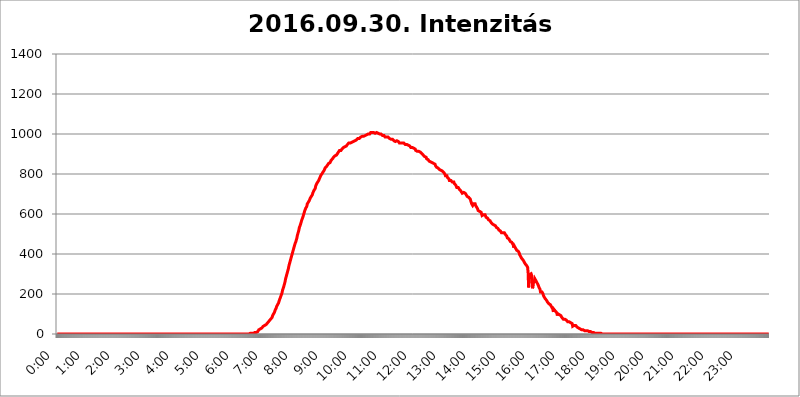
| Category | 2016.09.30. Intenzitás [W/m^2] |
|---|---|
| 0.0 | 0 |
| 0.0006944444444444445 | 0 |
| 0.001388888888888889 | 0 |
| 0.0020833333333333333 | 0 |
| 0.002777777777777778 | 0 |
| 0.003472222222222222 | 0 |
| 0.004166666666666667 | 0 |
| 0.004861111111111111 | 0 |
| 0.005555555555555556 | 0 |
| 0.0062499999999999995 | 0 |
| 0.006944444444444444 | 0 |
| 0.007638888888888889 | 0 |
| 0.008333333333333333 | 0 |
| 0.009027777777777779 | 0 |
| 0.009722222222222222 | 0 |
| 0.010416666666666666 | 0 |
| 0.011111111111111112 | 0 |
| 0.011805555555555555 | 0 |
| 0.012499999999999999 | 0 |
| 0.013194444444444444 | 0 |
| 0.013888888888888888 | 0 |
| 0.014583333333333332 | 0 |
| 0.015277777777777777 | 0 |
| 0.015972222222222224 | 0 |
| 0.016666666666666666 | 0 |
| 0.017361111111111112 | 0 |
| 0.018055555555555557 | 0 |
| 0.01875 | 0 |
| 0.019444444444444445 | 0 |
| 0.02013888888888889 | 0 |
| 0.020833333333333332 | 0 |
| 0.02152777777777778 | 0 |
| 0.022222222222222223 | 0 |
| 0.02291666666666667 | 0 |
| 0.02361111111111111 | 0 |
| 0.024305555555555556 | 0 |
| 0.024999999999999998 | 0 |
| 0.025694444444444447 | 0 |
| 0.02638888888888889 | 0 |
| 0.027083333333333334 | 0 |
| 0.027777777777777776 | 0 |
| 0.02847222222222222 | 0 |
| 0.029166666666666664 | 0 |
| 0.029861111111111113 | 0 |
| 0.030555555555555555 | 0 |
| 0.03125 | 0 |
| 0.03194444444444445 | 0 |
| 0.03263888888888889 | 0 |
| 0.03333333333333333 | 0 |
| 0.034027777777777775 | 0 |
| 0.034722222222222224 | 0 |
| 0.035416666666666666 | 0 |
| 0.036111111111111115 | 0 |
| 0.03680555555555556 | 0 |
| 0.0375 | 0 |
| 0.03819444444444444 | 0 |
| 0.03888888888888889 | 0 |
| 0.03958333333333333 | 0 |
| 0.04027777777777778 | 0 |
| 0.04097222222222222 | 0 |
| 0.041666666666666664 | 0 |
| 0.042361111111111106 | 0 |
| 0.04305555555555556 | 0 |
| 0.043750000000000004 | 0 |
| 0.044444444444444446 | 0 |
| 0.04513888888888889 | 0 |
| 0.04583333333333334 | 0 |
| 0.04652777777777778 | 0 |
| 0.04722222222222222 | 0 |
| 0.04791666666666666 | 0 |
| 0.04861111111111111 | 0 |
| 0.049305555555555554 | 0 |
| 0.049999999999999996 | 0 |
| 0.05069444444444445 | 0 |
| 0.051388888888888894 | 0 |
| 0.052083333333333336 | 0 |
| 0.05277777777777778 | 0 |
| 0.05347222222222222 | 0 |
| 0.05416666666666667 | 0 |
| 0.05486111111111111 | 0 |
| 0.05555555555555555 | 0 |
| 0.05625 | 0 |
| 0.05694444444444444 | 0 |
| 0.057638888888888885 | 0 |
| 0.05833333333333333 | 0 |
| 0.05902777777777778 | 0 |
| 0.059722222222222225 | 0 |
| 0.06041666666666667 | 0 |
| 0.061111111111111116 | 0 |
| 0.06180555555555556 | 0 |
| 0.0625 | 0 |
| 0.06319444444444444 | 0 |
| 0.06388888888888888 | 0 |
| 0.06458333333333334 | 0 |
| 0.06527777777777778 | 0 |
| 0.06597222222222222 | 0 |
| 0.06666666666666667 | 0 |
| 0.06736111111111111 | 0 |
| 0.06805555555555555 | 0 |
| 0.06874999999999999 | 0 |
| 0.06944444444444443 | 0 |
| 0.07013888888888889 | 0 |
| 0.07083333333333333 | 0 |
| 0.07152777777777779 | 0 |
| 0.07222222222222223 | 0 |
| 0.07291666666666667 | 0 |
| 0.07361111111111111 | 0 |
| 0.07430555555555556 | 0 |
| 0.075 | 0 |
| 0.07569444444444444 | 0 |
| 0.0763888888888889 | 0 |
| 0.07708333333333334 | 0 |
| 0.07777777777777778 | 0 |
| 0.07847222222222222 | 0 |
| 0.07916666666666666 | 0 |
| 0.0798611111111111 | 0 |
| 0.08055555555555556 | 0 |
| 0.08125 | 0 |
| 0.08194444444444444 | 0 |
| 0.08263888888888889 | 0 |
| 0.08333333333333333 | 0 |
| 0.08402777777777777 | 0 |
| 0.08472222222222221 | 0 |
| 0.08541666666666665 | 0 |
| 0.08611111111111112 | 0 |
| 0.08680555555555557 | 0 |
| 0.08750000000000001 | 0 |
| 0.08819444444444445 | 0 |
| 0.08888888888888889 | 0 |
| 0.08958333333333333 | 0 |
| 0.09027777777777778 | 0 |
| 0.09097222222222222 | 0 |
| 0.09166666666666667 | 0 |
| 0.09236111111111112 | 0 |
| 0.09305555555555556 | 0 |
| 0.09375 | 0 |
| 0.09444444444444444 | 0 |
| 0.09513888888888888 | 0 |
| 0.09583333333333333 | 0 |
| 0.09652777777777777 | 0 |
| 0.09722222222222222 | 0 |
| 0.09791666666666667 | 0 |
| 0.09861111111111111 | 0 |
| 0.09930555555555555 | 0 |
| 0.09999999999999999 | 0 |
| 0.10069444444444443 | 0 |
| 0.1013888888888889 | 0 |
| 0.10208333333333335 | 0 |
| 0.10277777777777779 | 0 |
| 0.10347222222222223 | 0 |
| 0.10416666666666667 | 0 |
| 0.10486111111111111 | 0 |
| 0.10555555555555556 | 0 |
| 0.10625 | 0 |
| 0.10694444444444444 | 0 |
| 0.1076388888888889 | 0 |
| 0.10833333333333334 | 0 |
| 0.10902777777777778 | 0 |
| 0.10972222222222222 | 0 |
| 0.1111111111111111 | 0 |
| 0.11180555555555556 | 0 |
| 0.11180555555555556 | 0 |
| 0.1125 | 0 |
| 0.11319444444444444 | 0 |
| 0.11388888888888889 | 0 |
| 0.11458333333333333 | 0 |
| 0.11527777777777777 | 0 |
| 0.11597222222222221 | 0 |
| 0.11666666666666665 | 0 |
| 0.1173611111111111 | 0 |
| 0.11805555555555557 | 0 |
| 0.11944444444444445 | 0 |
| 0.12013888888888889 | 0 |
| 0.12083333333333333 | 0 |
| 0.12152777777777778 | 0 |
| 0.12222222222222223 | 0 |
| 0.12291666666666667 | 0 |
| 0.12291666666666667 | 0 |
| 0.12361111111111112 | 0 |
| 0.12430555555555556 | 0 |
| 0.125 | 0 |
| 0.12569444444444444 | 0 |
| 0.12638888888888888 | 0 |
| 0.12708333333333333 | 0 |
| 0.16875 | 0 |
| 0.12847222222222224 | 0 |
| 0.12916666666666668 | 0 |
| 0.12986111111111112 | 0 |
| 0.13055555555555556 | 0 |
| 0.13125 | 0 |
| 0.13194444444444445 | 0 |
| 0.1326388888888889 | 0 |
| 0.13333333333333333 | 0 |
| 0.13402777777777777 | 0 |
| 0.13402777777777777 | 0 |
| 0.13472222222222222 | 0 |
| 0.13541666666666666 | 0 |
| 0.1361111111111111 | 0 |
| 0.13749999999999998 | 0 |
| 0.13819444444444443 | 0 |
| 0.1388888888888889 | 0 |
| 0.13958333333333334 | 0 |
| 0.14027777777777778 | 0 |
| 0.14097222222222222 | 0 |
| 0.14166666666666666 | 0 |
| 0.1423611111111111 | 0 |
| 0.14305555555555557 | 0 |
| 0.14375000000000002 | 0 |
| 0.14444444444444446 | 0 |
| 0.1451388888888889 | 0 |
| 0.1451388888888889 | 0 |
| 0.14652777777777778 | 0 |
| 0.14722222222222223 | 0 |
| 0.14791666666666667 | 0 |
| 0.1486111111111111 | 0 |
| 0.14930555555555555 | 0 |
| 0.15 | 0 |
| 0.15069444444444444 | 0 |
| 0.15138888888888888 | 0 |
| 0.15208333333333332 | 0 |
| 0.15277777777777776 | 0 |
| 0.15347222222222223 | 0 |
| 0.15416666666666667 | 0 |
| 0.15486111111111112 | 0 |
| 0.15555555555555556 | 0 |
| 0.15625 | 0 |
| 0.15694444444444444 | 0 |
| 0.15763888888888888 | 0 |
| 0.15833333333333333 | 0 |
| 0.15902777777777777 | 0 |
| 0.15972222222222224 | 0 |
| 0.16041666666666668 | 0 |
| 0.16111111111111112 | 0 |
| 0.16180555555555556 | 0 |
| 0.1625 | 0 |
| 0.16319444444444445 | 0 |
| 0.1638888888888889 | 0 |
| 0.16458333333333333 | 0 |
| 0.16527777777777777 | 0 |
| 0.16597222222222222 | 0 |
| 0.16666666666666666 | 0 |
| 0.1673611111111111 | 0 |
| 0.16805555555555554 | 0 |
| 0.16874999999999998 | 0 |
| 0.16944444444444443 | 0 |
| 0.17013888888888887 | 0 |
| 0.1708333333333333 | 0 |
| 0.17152777777777775 | 0 |
| 0.17222222222222225 | 0 |
| 0.1729166666666667 | 0 |
| 0.17361111111111113 | 0 |
| 0.17430555555555557 | 0 |
| 0.17500000000000002 | 0 |
| 0.17569444444444446 | 0 |
| 0.1763888888888889 | 0 |
| 0.17708333333333334 | 0 |
| 0.17777777777777778 | 0 |
| 0.17847222222222223 | 0 |
| 0.17916666666666667 | 0 |
| 0.1798611111111111 | 0 |
| 0.18055555555555555 | 0 |
| 0.18125 | 0 |
| 0.18194444444444444 | 0 |
| 0.1826388888888889 | 0 |
| 0.18333333333333335 | 0 |
| 0.1840277777777778 | 0 |
| 0.18472222222222223 | 0 |
| 0.18541666666666667 | 0 |
| 0.18611111111111112 | 0 |
| 0.18680555555555556 | 0 |
| 0.1875 | 0 |
| 0.18819444444444444 | 0 |
| 0.18888888888888888 | 0 |
| 0.18958333333333333 | 0 |
| 0.19027777777777777 | 0 |
| 0.1909722222222222 | 0 |
| 0.19166666666666665 | 0 |
| 0.19236111111111112 | 0 |
| 0.19305555555555554 | 0 |
| 0.19375 | 0 |
| 0.19444444444444445 | 0 |
| 0.1951388888888889 | 0 |
| 0.19583333333333333 | 0 |
| 0.19652777777777777 | 0 |
| 0.19722222222222222 | 0 |
| 0.19791666666666666 | 0 |
| 0.1986111111111111 | 0 |
| 0.19930555555555554 | 0 |
| 0.19999999999999998 | 0 |
| 0.20069444444444443 | 0 |
| 0.20138888888888887 | 0 |
| 0.2020833333333333 | 0 |
| 0.2027777777777778 | 0 |
| 0.2034722222222222 | 0 |
| 0.2041666666666667 | 0 |
| 0.20486111111111113 | 0 |
| 0.20555555555555557 | 0 |
| 0.20625000000000002 | 0 |
| 0.20694444444444446 | 0 |
| 0.2076388888888889 | 0 |
| 0.20833333333333334 | 0 |
| 0.20902777777777778 | 0 |
| 0.20972222222222223 | 0 |
| 0.21041666666666667 | 0 |
| 0.2111111111111111 | 0 |
| 0.21180555555555555 | 0 |
| 0.2125 | 0 |
| 0.21319444444444444 | 0 |
| 0.2138888888888889 | 0 |
| 0.21458333333333335 | 0 |
| 0.2152777777777778 | 0 |
| 0.21597222222222223 | 0 |
| 0.21666666666666667 | 0 |
| 0.21736111111111112 | 0 |
| 0.21805555555555556 | 0 |
| 0.21875 | 0 |
| 0.21944444444444444 | 0 |
| 0.22013888888888888 | 0 |
| 0.22083333333333333 | 0 |
| 0.22152777777777777 | 0 |
| 0.2222222222222222 | 0 |
| 0.22291666666666665 | 0 |
| 0.2236111111111111 | 0 |
| 0.22430555555555556 | 0 |
| 0.225 | 0 |
| 0.22569444444444445 | 0 |
| 0.2263888888888889 | 0 |
| 0.22708333333333333 | 0 |
| 0.22777777777777777 | 0 |
| 0.22847222222222222 | 0 |
| 0.22916666666666666 | 0 |
| 0.2298611111111111 | 0 |
| 0.23055555555555554 | 0 |
| 0.23124999999999998 | 0 |
| 0.23194444444444443 | 0 |
| 0.23263888888888887 | 0 |
| 0.2333333333333333 | 0 |
| 0.2340277777777778 | 0 |
| 0.2347222222222222 | 0 |
| 0.2354166666666667 | 0 |
| 0.23611111111111113 | 0 |
| 0.23680555555555557 | 0 |
| 0.23750000000000002 | 0 |
| 0.23819444444444446 | 0 |
| 0.2388888888888889 | 0 |
| 0.23958333333333334 | 0 |
| 0.24027777777777778 | 0 |
| 0.24097222222222223 | 0 |
| 0.24166666666666667 | 0 |
| 0.2423611111111111 | 0 |
| 0.24305555555555555 | 0 |
| 0.24375 | 0 |
| 0.24444444444444446 | 0 |
| 0.24513888888888888 | 0 |
| 0.24583333333333335 | 0 |
| 0.2465277777777778 | 0 |
| 0.24722222222222223 | 0 |
| 0.24791666666666667 | 0 |
| 0.24861111111111112 | 0 |
| 0.24930555555555556 | 0 |
| 0.25 | 0 |
| 0.25069444444444444 | 0 |
| 0.2513888888888889 | 0 |
| 0.2520833333333333 | 0 |
| 0.25277777777777777 | 0 |
| 0.2534722222222222 | 0 |
| 0.25416666666666665 | 0 |
| 0.2548611111111111 | 0 |
| 0.2555555555555556 | 0 |
| 0.25625000000000003 | 0 |
| 0.2569444444444445 | 0 |
| 0.2576388888888889 | 0 |
| 0.25833333333333336 | 0 |
| 0.2590277777777778 | 0 |
| 0.25972222222222224 | 0 |
| 0.2604166666666667 | 0 |
| 0.2611111111111111 | 0 |
| 0.26180555555555557 | 0 |
| 0.2625 | 0 |
| 0.26319444444444445 | 0 |
| 0.2638888888888889 | 0 |
| 0.26458333333333334 | 0 |
| 0.2652777777777778 | 0 |
| 0.2659722222222222 | 0 |
| 0.26666666666666666 | 0 |
| 0.2673611111111111 | 0 |
| 0.26805555555555555 | 0 |
| 0.26875 | 0 |
| 0.26944444444444443 | 0 |
| 0.2701388888888889 | 3.525 |
| 0.2708333333333333 | 3.525 |
| 0.27152777777777776 | 3.525 |
| 0.2722222222222222 | 3.525 |
| 0.27291666666666664 | 3.525 |
| 0.2736111111111111 | 3.525 |
| 0.2743055555555555 | 3.525 |
| 0.27499999999999997 | 3.525 |
| 0.27569444444444446 | 3.525 |
| 0.27638888888888885 | 7.887 |
| 0.27708333333333335 | 7.887 |
| 0.2777777777777778 | 7.887 |
| 0.27847222222222223 | 7.887 |
| 0.2791666666666667 | 7.887 |
| 0.2798611111111111 | 12.257 |
| 0.28055555555555556 | 12.257 |
| 0.28125 | 12.257 |
| 0.28194444444444444 | 16.636 |
| 0.2826388888888889 | 21.024 |
| 0.2833333333333333 | 21.024 |
| 0.28402777777777777 | 25.419 |
| 0.2847222222222222 | 25.419 |
| 0.28541666666666665 | 29.823 |
| 0.28611111111111115 | 29.823 |
| 0.28680555555555554 | 29.823 |
| 0.28750000000000003 | 34.234 |
| 0.2881944444444445 | 34.234 |
| 0.2888888888888889 | 38.653 |
| 0.28958333333333336 | 38.653 |
| 0.2902777777777778 | 38.653 |
| 0.29097222222222224 | 43.079 |
| 0.2916666666666667 | 43.079 |
| 0.2923611111111111 | 47.511 |
| 0.29305555555555557 | 47.511 |
| 0.29375 | 51.951 |
| 0.29444444444444445 | 51.951 |
| 0.2951388888888889 | 56.398 |
| 0.29583333333333334 | 56.398 |
| 0.2965277777777778 | 60.85 |
| 0.2972222222222222 | 65.31 |
| 0.29791666666666666 | 65.31 |
| 0.2986111111111111 | 69.775 |
| 0.29930555555555555 | 74.246 |
| 0.3 | 74.246 |
| 0.30069444444444443 | 78.722 |
| 0.3013888888888889 | 83.205 |
| 0.3020833333333333 | 92.184 |
| 0.30277777777777776 | 92.184 |
| 0.3034722222222222 | 101.184 |
| 0.30416666666666664 | 105.69 |
| 0.3048611111111111 | 110.201 |
| 0.3055555555555555 | 119.235 |
| 0.30624999999999997 | 123.758 |
| 0.3069444444444444 | 128.284 |
| 0.3076388888888889 | 137.347 |
| 0.30833333333333335 | 141.884 |
| 0.3090277777777778 | 146.423 |
| 0.30972222222222223 | 150.964 |
| 0.3104166666666667 | 155.509 |
| 0.3111111111111111 | 164.605 |
| 0.31180555555555556 | 169.156 |
| 0.3125 | 178.264 |
| 0.31319444444444444 | 182.82 |
| 0.3138888888888889 | 191.937 |
| 0.3145833333333333 | 196.497 |
| 0.31527777777777777 | 205.62 |
| 0.3159722222222222 | 219.309 |
| 0.31666666666666665 | 223.873 |
| 0.31736111111111115 | 233 |
| 0.31805555555555554 | 242.127 |
| 0.31875000000000003 | 251.251 |
| 0.3194444444444445 | 260.373 |
| 0.3201388888888889 | 274.047 |
| 0.32083333333333336 | 283.156 |
| 0.3215277777777778 | 292.259 |
| 0.32222222222222224 | 301.354 |
| 0.3229166666666667 | 310.44 |
| 0.3236111111111111 | 319.517 |
| 0.32430555555555557 | 328.584 |
| 0.325 | 342.162 |
| 0.32569444444444445 | 351.198 |
| 0.3263888888888889 | 360.221 |
| 0.32708333333333334 | 369.23 |
| 0.3277777777777778 | 378.224 |
| 0.3284722222222222 | 387.202 |
| 0.32916666666666666 | 396.164 |
| 0.3298611111111111 | 405.108 |
| 0.33055555555555555 | 414.035 |
| 0.33125 | 422.943 |
| 0.33194444444444443 | 431.833 |
| 0.3326388888888889 | 440.702 |
| 0.3333333333333333 | 449.551 |
| 0.3340277777777778 | 453.968 |
| 0.3347222222222222 | 462.786 |
| 0.3354166666666667 | 471.582 |
| 0.3361111111111111 | 480.356 |
| 0.3368055555555556 | 493.475 |
| 0.33749999999999997 | 502.192 |
| 0.33819444444444446 | 510.885 |
| 0.33888888888888885 | 519.555 |
| 0.33958333333333335 | 532.513 |
| 0.34027777777777773 | 536.82 |
| 0.34097222222222223 | 545.416 |
| 0.3416666666666666 | 553.986 |
| 0.3423611111111111 | 562.53 |
| 0.3430555555555555 | 571.049 |
| 0.34375 | 575.299 |
| 0.3444444444444445 | 583.779 |
| 0.3451388888888889 | 588.009 |
| 0.3458333333333334 | 600.661 |
| 0.34652777777777777 | 600.661 |
| 0.34722222222222227 | 617.436 |
| 0.34791666666666665 | 617.436 |
| 0.34861111111111115 | 629.948 |
| 0.34930555555555554 | 634.105 |
| 0.35000000000000003 | 638.256 |
| 0.3506944444444444 | 650.667 |
| 0.3513888888888889 | 654.791 |
| 0.3520833333333333 | 658.909 |
| 0.3527777777777778 | 663.019 |
| 0.3534722222222222 | 667.123 |
| 0.3541666666666667 | 671.22 |
| 0.3548611111111111 | 679.395 |
| 0.35555555555555557 | 683.473 |
| 0.35625 | 687.544 |
| 0.35694444444444445 | 691.608 |
| 0.3576388888888889 | 695.666 |
| 0.35833333333333334 | 703.762 |
| 0.3590277777777778 | 707.8 |
| 0.3597222222222222 | 715.858 |
| 0.36041666666666666 | 719.877 |
| 0.3611111111111111 | 719.877 |
| 0.36180555555555555 | 727.896 |
| 0.3625 | 739.877 |
| 0.36319444444444443 | 743.859 |
| 0.3638888888888889 | 751.803 |
| 0.3645833333333333 | 755.766 |
| 0.3652777777777778 | 759.723 |
| 0.3659722222222222 | 763.674 |
| 0.3666666666666667 | 767.62 |
| 0.3673611111111111 | 771.559 |
| 0.3680555555555556 | 779.42 |
| 0.36874999999999997 | 783.342 |
| 0.36944444444444446 | 791.169 |
| 0.37013888888888885 | 787.258 |
| 0.37083333333333335 | 795.074 |
| 0.37152777777777773 | 802.868 |
| 0.37222222222222223 | 806.757 |
| 0.3729166666666666 | 810.641 |
| 0.3736111111111111 | 814.519 |
| 0.3743055555555555 | 818.392 |
| 0.375 | 822.26 |
| 0.3756944444444445 | 829.981 |
| 0.3763888888888889 | 829.981 |
| 0.3770833333333334 | 833.834 |
| 0.37777777777777777 | 837.682 |
| 0.37847222222222227 | 841.526 |
| 0.37916666666666665 | 845.365 |
| 0.37986111111111115 | 845.365 |
| 0.38055555555555554 | 853.029 |
| 0.38125000000000003 | 853.029 |
| 0.3819444444444444 | 853.029 |
| 0.3826388888888889 | 856.855 |
| 0.3833333333333333 | 860.676 |
| 0.3840277777777778 | 868.305 |
| 0.3847222222222222 | 868.305 |
| 0.3854166666666667 | 872.114 |
| 0.3861111111111111 | 875.918 |
| 0.38680555555555557 | 875.918 |
| 0.3875 | 883.516 |
| 0.38819444444444445 | 887.309 |
| 0.3888888888888889 | 887.309 |
| 0.38958333333333334 | 891.099 |
| 0.3902777777777778 | 894.885 |
| 0.3909722222222222 | 894.885 |
| 0.39166666666666666 | 894.885 |
| 0.3923611111111111 | 898.668 |
| 0.39305555555555555 | 902.447 |
| 0.39375 | 906.223 |
| 0.39444444444444443 | 909.996 |
| 0.3951388888888889 | 913.766 |
| 0.3958333333333333 | 917.534 |
| 0.3965277777777778 | 917.534 |
| 0.3972222222222222 | 917.534 |
| 0.3979166666666667 | 917.534 |
| 0.3986111111111111 | 921.298 |
| 0.3993055555555556 | 925.06 |
| 0.39999999999999997 | 925.06 |
| 0.40069444444444446 | 928.819 |
| 0.40138888888888885 | 932.576 |
| 0.40208333333333335 | 932.576 |
| 0.40277777777777773 | 932.576 |
| 0.40347222222222223 | 936.33 |
| 0.4041666666666666 | 936.33 |
| 0.4048611111111111 | 940.082 |
| 0.4055555555555555 | 940.082 |
| 0.40625 | 943.832 |
| 0.4069444444444445 | 947.58 |
| 0.4076388888888889 | 947.58 |
| 0.4083333333333334 | 951.327 |
| 0.40902777777777777 | 955.071 |
| 0.40972222222222227 | 955.071 |
| 0.41041666666666665 | 955.071 |
| 0.41111111111111115 | 955.071 |
| 0.41180555555555554 | 955.071 |
| 0.41250000000000003 | 955.071 |
| 0.4131944444444444 | 958.814 |
| 0.4138888888888889 | 958.814 |
| 0.4145833333333333 | 962.555 |
| 0.4152777777777778 | 962.555 |
| 0.4159722222222222 | 962.555 |
| 0.4166666666666667 | 966.295 |
| 0.4173611111111111 | 966.295 |
| 0.41805555555555557 | 970.034 |
| 0.41875 | 970.034 |
| 0.41944444444444445 | 970.034 |
| 0.4201388888888889 | 970.034 |
| 0.42083333333333334 | 970.034 |
| 0.4215277777777778 | 977.508 |
| 0.4222222222222222 | 977.508 |
| 0.42291666666666666 | 977.508 |
| 0.4236111111111111 | 977.508 |
| 0.42430555555555555 | 977.508 |
| 0.425 | 981.244 |
| 0.42569444444444443 | 984.98 |
| 0.4263888888888889 | 984.98 |
| 0.4270833333333333 | 984.98 |
| 0.4277777777777778 | 988.714 |
| 0.4284722222222222 | 988.714 |
| 0.4291666666666667 | 988.714 |
| 0.4298611111111111 | 988.714 |
| 0.4305555555555556 | 992.448 |
| 0.43124999999999997 | 992.448 |
| 0.43194444444444446 | 992.448 |
| 0.43263888888888885 | 992.448 |
| 0.43333333333333335 | 992.448 |
| 0.43402777777777773 | 996.182 |
| 0.43472222222222223 | 996.182 |
| 0.4354166666666666 | 996.182 |
| 0.4361111111111111 | 999.916 |
| 0.4368055555555555 | 999.916 |
| 0.4375 | 999.916 |
| 0.4381944444444445 | 999.916 |
| 0.4388888888888889 | 1003.65 |
| 0.4395833333333334 | 1007.383 |
| 0.44027777777777777 | 1003.65 |
| 0.44097222222222227 | 1003.65 |
| 0.44166666666666665 | 1007.383 |
| 0.44236111111111115 | 1007.383 |
| 0.44305555555555554 | 1007.383 |
| 0.44375000000000003 | 1007.383 |
| 0.4444444444444444 | 1007.383 |
| 0.4451388888888889 | 1007.383 |
| 0.4458333333333333 | 1003.65 |
| 0.4465277777777778 | 1007.383 |
| 0.4472222222222222 | 1007.383 |
| 0.4479166666666667 | 1007.383 |
| 0.4486111111111111 | 1007.383 |
| 0.44930555555555557 | 1007.383 |
| 0.45 | 1003.65 |
| 0.45069444444444445 | 999.916 |
| 0.4513888888888889 | 999.916 |
| 0.45208333333333334 | 999.916 |
| 0.4527777777777778 | 999.916 |
| 0.4534722222222222 | 999.916 |
| 0.45416666666666666 | 999.916 |
| 0.4548611111111111 | 996.182 |
| 0.45555555555555555 | 996.182 |
| 0.45625 | 992.448 |
| 0.45694444444444443 | 992.448 |
| 0.4576388888888889 | 992.448 |
| 0.4583333333333333 | 992.448 |
| 0.4590277777777778 | 988.714 |
| 0.4597222222222222 | 984.98 |
| 0.4604166666666667 | 984.98 |
| 0.4611111111111111 | 984.98 |
| 0.4618055555555556 | 984.98 |
| 0.46249999999999997 | 981.244 |
| 0.46319444444444446 | 981.244 |
| 0.46388888888888885 | 984.98 |
| 0.46458333333333335 | 981.244 |
| 0.46527777777777773 | 981.244 |
| 0.46597222222222223 | 977.508 |
| 0.4666666666666666 | 977.508 |
| 0.4673611111111111 | 973.772 |
| 0.4680555555555555 | 973.772 |
| 0.46875 | 970.034 |
| 0.4694444444444445 | 970.034 |
| 0.4701388888888889 | 973.772 |
| 0.4708333333333334 | 970.034 |
| 0.47152777777777777 | 970.034 |
| 0.47222222222222227 | 966.295 |
| 0.47291666666666665 | 966.295 |
| 0.47361111111111115 | 962.555 |
| 0.47430555555555554 | 962.555 |
| 0.47500000000000003 | 966.295 |
| 0.4756944444444444 | 966.295 |
| 0.4763888888888889 | 966.295 |
| 0.4770833333333333 | 962.555 |
| 0.4777777777777778 | 966.295 |
| 0.4784722222222222 | 962.555 |
| 0.4791666666666667 | 958.814 |
| 0.4798611111111111 | 955.071 |
| 0.48055555555555557 | 955.071 |
| 0.48125 | 955.071 |
| 0.48194444444444445 | 955.071 |
| 0.4826388888888889 | 955.071 |
| 0.48333333333333334 | 958.814 |
| 0.4840277777777778 | 955.071 |
| 0.4847222222222222 | 955.071 |
| 0.48541666666666666 | 955.071 |
| 0.4861111111111111 | 955.071 |
| 0.48680555555555555 | 955.071 |
| 0.4875 | 951.327 |
| 0.48819444444444443 | 947.58 |
| 0.4888888888888889 | 947.58 |
| 0.4895833333333333 | 947.58 |
| 0.4902777777777778 | 947.58 |
| 0.4909722222222222 | 947.58 |
| 0.4916666666666667 | 943.832 |
| 0.4923611111111111 | 943.832 |
| 0.4930555555555556 | 943.832 |
| 0.49374999999999997 | 940.082 |
| 0.49444444444444446 | 940.082 |
| 0.49513888888888885 | 936.33 |
| 0.49583333333333335 | 932.576 |
| 0.49652777777777773 | 932.576 |
| 0.49722222222222223 | 932.576 |
| 0.4979166666666666 | 932.576 |
| 0.4986111111111111 | 932.576 |
| 0.4993055555555555 | 928.819 |
| 0.5 | 928.819 |
| 0.5006944444444444 | 925.06 |
| 0.5013888888888889 | 925.06 |
| 0.5020833333333333 | 925.06 |
| 0.5027777777777778 | 917.534 |
| 0.5034722222222222 | 917.534 |
| 0.5041666666666667 | 917.534 |
| 0.5048611111111111 | 913.766 |
| 0.5055555555555555 | 917.534 |
| 0.50625 | 917.534 |
| 0.5069444444444444 | 913.766 |
| 0.5076388888888889 | 913.766 |
| 0.5083333333333333 | 913.766 |
| 0.5090277777777777 | 909.996 |
| 0.5097222222222222 | 909.996 |
| 0.5104166666666666 | 906.223 |
| 0.5111111111111112 | 902.447 |
| 0.5118055555555555 | 898.668 |
| 0.5125000000000001 | 898.668 |
| 0.5131944444444444 | 894.885 |
| 0.513888888888889 | 891.099 |
| 0.5145833333333333 | 891.099 |
| 0.5152777777777778 | 887.309 |
| 0.5159722222222222 | 887.309 |
| 0.5166666666666667 | 883.516 |
| 0.517361111111111 | 883.516 |
| 0.5180555555555556 | 875.918 |
| 0.5187499999999999 | 875.918 |
| 0.5194444444444445 | 875.918 |
| 0.5201388888888888 | 872.114 |
| 0.5208333333333334 | 868.305 |
| 0.5215277777777778 | 864.493 |
| 0.5222222222222223 | 860.676 |
| 0.5229166666666667 | 860.676 |
| 0.5236111111111111 | 860.676 |
| 0.5243055555555556 | 856.855 |
| 0.525 | 856.855 |
| 0.5256944444444445 | 856.855 |
| 0.5263888888888889 | 856.855 |
| 0.5270833333333333 | 853.029 |
| 0.5277777777777778 | 853.029 |
| 0.5284722222222222 | 853.029 |
| 0.5291666666666667 | 849.199 |
| 0.5298611111111111 | 849.199 |
| 0.5305555555555556 | 841.526 |
| 0.53125 | 837.682 |
| 0.5319444444444444 | 833.834 |
| 0.5326388888888889 | 829.981 |
| 0.5333333333333333 | 829.981 |
| 0.5340277777777778 | 829.981 |
| 0.5347222222222222 | 829.981 |
| 0.5354166666666667 | 829.981 |
| 0.5361111111111111 | 822.26 |
| 0.5368055555555555 | 822.26 |
| 0.5375 | 822.26 |
| 0.5381944444444444 | 818.392 |
| 0.5388888888888889 | 818.392 |
| 0.5395833333333333 | 818.392 |
| 0.5402777777777777 | 814.519 |
| 0.5409722222222222 | 814.519 |
| 0.5416666666666666 | 810.641 |
| 0.5423611111111112 | 806.757 |
| 0.5430555555555555 | 802.868 |
| 0.5437500000000001 | 798.974 |
| 0.5444444444444444 | 791.169 |
| 0.545138888888889 | 791.169 |
| 0.5458333333333333 | 791.169 |
| 0.5465277777777778 | 791.169 |
| 0.5472222222222222 | 783.342 |
| 0.5479166666666667 | 783.342 |
| 0.548611111111111 | 779.42 |
| 0.5493055555555556 | 775.492 |
| 0.5499999999999999 | 767.62 |
| 0.5506944444444445 | 767.62 |
| 0.5513888888888888 | 767.62 |
| 0.5520833333333334 | 767.62 |
| 0.5527777777777778 | 767.62 |
| 0.5534722222222223 | 763.674 |
| 0.5541666666666667 | 759.723 |
| 0.5548611111111111 | 759.723 |
| 0.5555555555555556 | 759.723 |
| 0.55625 | 759.723 |
| 0.5569444444444445 | 751.803 |
| 0.5576388888888889 | 751.803 |
| 0.5583333333333333 | 747.834 |
| 0.5590277777777778 | 743.859 |
| 0.5597222222222222 | 739.877 |
| 0.5604166666666667 | 731.896 |
| 0.5611111111111111 | 731.896 |
| 0.5618055555555556 | 731.896 |
| 0.5625 | 731.896 |
| 0.5631944444444444 | 727.896 |
| 0.5638888888888889 | 723.889 |
| 0.5645833333333333 | 723.889 |
| 0.5652777777777778 | 719.877 |
| 0.5659722222222222 | 715.858 |
| 0.5666666666666667 | 711.832 |
| 0.5673611111111111 | 711.832 |
| 0.5680555555555555 | 703.762 |
| 0.56875 | 703.762 |
| 0.5694444444444444 | 703.762 |
| 0.5701388888888889 | 707.8 |
| 0.5708333333333333 | 703.762 |
| 0.5715277777777777 | 703.762 |
| 0.5722222222222222 | 703.762 |
| 0.5729166666666666 | 699.717 |
| 0.5736111111111112 | 695.666 |
| 0.5743055555555555 | 691.608 |
| 0.5750000000000001 | 687.544 |
| 0.5756944444444444 | 687.544 |
| 0.576388888888889 | 683.473 |
| 0.5770833333333333 | 683.473 |
| 0.5777777777777778 | 679.395 |
| 0.5784722222222222 | 679.395 |
| 0.5791666666666667 | 675.311 |
| 0.579861111111111 | 667.123 |
| 0.5805555555555556 | 667.123 |
| 0.5812499999999999 | 650.667 |
| 0.5819444444444445 | 646.537 |
| 0.5826388888888888 | 642.4 |
| 0.5833333333333334 | 646.537 |
| 0.5840277777777778 | 650.667 |
| 0.5847222222222223 | 650.667 |
| 0.5854166666666667 | 650.667 |
| 0.5861111111111111 | 650.667 |
| 0.5868055555555556 | 642.4 |
| 0.5875 | 638.256 |
| 0.5881944444444445 | 634.105 |
| 0.5888888888888889 | 629.948 |
| 0.5895833333333333 | 625.784 |
| 0.5902777777777778 | 617.436 |
| 0.5909722222222222 | 613.252 |
| 0.5916666666666667 | 613.252 |
| 0.5923611111111111 | 613.252 |
| 0.5930555555555556 | 617.436 |
| 0.59375 | 613.252 |
| 0.5944444444444444 | 609.062 |
| 0.5951388888888889 | 600.661 |
| 0.5958333333333333 | 592.233 |
| 0.5965277777777778 | 592.233 |
| 0.5972222222222222 | 596.45 |
| 0.5979166666666667 | 596.45 |
| 0.5986111111111111 | 596.45 |
| 0.5993055555555555 | 592.233 |
| 0.6 | 596.45 |
| 0.6006944444444444 | 592.233 |
| 0.6013888888888889 | 583.779 |
| 0.6020833333333333 | 583.779 |
| 0.6027777777777777 | 579.542 |
| 0.6034722222222222 | 579.542 |
| 0.6041666666666666 | 575.299 |
| 0.6048611111111112 | 571.049 |
| 0.6055555555555555 | 571.049 |
| 0.6062500000000001 | 571.049 |
| 0.6069444444444444 | 566.793 |
| 0.607638888888889 | 566.793 |
| 0.6083333333333333 | 558.261 |
| 0.6090277777777778 | 558.261 |
| 0.6097222222222222 | 553.986 |
| 0.6104166666666667 | 549.704 |
| 0.611111111111111 | 553.986 |
| 0.6118055555555556 | 549.704 |
| 0.6124999999999999 | 545.416 |
| 0.6131944444444445 | 545.416 |
| 0.6138888888888888 | 541.121 |
| 0.6145833333333334 | 541.121 |
| 0.6152777777777778 | 536.82 |
| 0.6159722222222223 | 532.513 |
| 0.6166666666666667 | 536.82 |
| 0.6173611111111111 | 532.513 |
| 0.6180555555555556 | 528.2 |
| 0.61875 | 523.88 |
| 0.6194444444444445 | 519.555 |
| 0.6201388888888889 | 519.555 |
| 0.6208333333333333 | 515.223 |
| 0.6215277777777778 | 515.223 |
| 0.6222222222222222 | 510.885 |
| 0.6229166666666667 | 506.542 |
| 0.6236111111111111 | 506.542 |
| 0.6243055555555556 | 506.542 |
| 0.625 | 506.542 |
| 0.6256944444444444 | 506.542 |
| 0.6263888888888889 | 506.542 |
| 0.6270833333333333 | 506.542 |
| 0.6277777777777778 | 502.192 |
| 0.6284722222222222 | 497.836 |
| 0.6291666666666667 | 493.475 |
| 0.6298611111111111 | 493.475 |
| 0.6305555555555555 | 489.108 |
| 0.63125 | 480.356 |
| 0.6319444444444444 | 475.972 |
| 0.6326388888888889 | 475.972 |
| 0.6333333333333333 | 475.972 |
| 0.6340277777777777 | 475.972 |
| 0.6347222222222222 | 471.582 |
| 0.6354166666666666 | 462.786 |
| 0.6361111111111112 | 462.786 |
| 0.6368055555555555 | 458.38 |
| 0.6375000000000001 | 458.38 |
| 0.6381944444444444 | 453.968 |
| 0.638888888888889 | 453.968 |
| 0.6395833333333333 | 445.129 |
| 0.6402777777777778 | 431.833 |
| 0.6409722222222222 | 440.702 |
| 0.6416666666666667 | 436.27 |
| 0.642361111111111 | 436.27 |
| 0.6430555555555556 | 427.39 |
| 0.6437499999999999 | 422.943 |
| 0.6444444444444445 | 418.492 |
| 0.6451388888888888 | 418.492 |
| 0.6458333333333334 | 414.035 |
| 0.6465277777777778 | 414.035 |
| 0.6472222222222223 | 409.574 |
| 0.6479166666666667 | 405.108 |
| 0.6486111111111111 | 396.164 |
| 0.6493055555555556 | 391.685 |
| 0.65 | 387.202 |
| 0.6506944444444445 | 382.715 |
| 0.6513888888888889 | 378.224 |
| 0.6520833333333333 | 378.224 |
| 0.6527777777777778 | 373.729 |
| 0.6534722222222222 | 369.23 |
| 0.6541666666666667 | 369.23 |
| 0.6548611111111111 | 360.221 |
| 0.6555555555555556 | 355.712 |
| 0.65625 | 351.198 |
| 0.6569444444444444 | 351.198 |
| 0.6576388888888889 | 346.682 |
| 0.6583333333333333 | 342.162 |
| 0.6590277777777778 | 337.639 |
| 0.6597222222222222 | 333.113 |
| 0.6604166666666667 | 305.898 |
| 0.6611111111111111 | 233 |
| 0.6618055555555555 | 274.047 |
| 0.6625 | 296.808 |
| 0.6631944444444444 | 301.354 |
| 0.6638888888888889 | 301.354 |
| 0.6645833333333333 | 301.354 |
| 0.6652777777777777 | 296.808 |
| 0.6659722222222222 | 287.709 |
| 0.6666666666666666 | 228.436 |
| 0.6673611111111111 | 223.873 |
| 0.6680555555555556 | 269.49 |
| 0.6687500000000001 | 274.047 |
| 0.6694444444444444 | 255.813 |
| 0.6701388888888888 | 274.047 |
| 0.6708333333333334 | 269.49 |
| 0.6715277777777778 | 264.932 |
| 0.6722222222222222 | 260.373 |
| 0.6729166666666666 | 255.813 |
| 0.6736111111111112 | 251.251 |
| 0.6743055555555556 | 246.689 |
| 0.6749999999999999 | 242.127 |
| 0.6756944444444444 | 233 |
| 0.6763888888888889 | 228.436 |
| 0.6770833333333334 | 223.873 |
| 0.6777777777777777 | 210.182 |
| 0.6784722222222223 | 214.746 |
| 0.6791666666666667 | 210.182 |
| 0.6798611111111111 | 210.182 |
| 0.6805555555555555 | 205.62 |
| 0.68125 | 201.058 |
| 0.6819444444444445 | 191.937 |
| 0.6826388888888889 | 191.937 |
| 0.6833333333333332 | 187.378 |
| 0.6840277777777778 | 178.264 |
| 0.6847222222222222 | 173.709 |
| 0.6854166666666667 | 173.709 |
| 0.686111111111111 | 169.156 |
| 0.6868055555555556 | 164.605 |
| 0.6875 | 160.056 |
| 0.6881944444444444 | 155.509 |
| 0.688888888888889 | 155.509 |
| 0.6895833333333333 | 150.964 |
| 0.6902777777777778 | 150.964 |
| 0.6909722222222222 | 146.423 |
| 0.6916666666666668 | 146.423 |
| 0.6923611111111111 | 141.884 |
| 0.6930555555555555 | 137.347 |
| 0.69375 | 137.347 |
| 0.6944444444444445 | 137.347 |
| 0.6951388888888889 | 123.758 |
| 0.6958333333333333 | 110.201 |
| 0.6965277777777777 | 123.758 |
| 0.6972222222222223 | 119.235 |
| 0.6979166666666666 | 119.235 |
| 0.6986111111111111 | 114.716 |
| 0.6993055555555556 | 114.716 |
| 0.7000000000000001 | 110.201 |
| 0.7006944444444444 | 105.69 |
| 0.7013888888888888 | 92.184 |
| 0.7020833333333334 | 101.184 |
| 0.7027777777777778 | 101.184 |
| 0.7034722222222222 | 101.184 |
| 0.7041666666666666 | 96.682 |
| 0.7048611111111112 | 96.682 |
| 0.7055555555555556 | 92.184 |
| 0.7062499999999999 | 92.184 |
| 0.7069444444444444 | 87.692 |
| 0.7076388888888889 | 83.205 |
| 0.7083333333333334 | 83.205 |
| 0.7090277777777777 | 78.722 |
| 0.7097222222222223 | 74.246 |
| 0.7104166666666667 | 74.246 |
| 0.7111111111111111 | 74.246 |
| 0.7118055555555555 | 74.246 |
| 0.7125 | 69.775 |
| 0.7131944444444445 | 69.775 |
| 0.7138888888888889 | 69.775 |
| 0.7145833333333332 | 65.31 |
| 0.7152777777777778 | 65.31 |
| 0.7159722222222222 | 60.85 |
| 0.7166666666666667 | 60.85 |
| 0.717361111111111 | 60.85 |
| 0.7180555555555556 | 60.85 |
| 0.71875 | 56.398 |
| 0.7194444444444444 | 56.398 |
| 0.720138888888889 | 56.398 |
| 0.7208333333333333 | 51.951 |
| 0.7215277777777778 | 51.951 |
| 0.7222222222222222 | 51.951 |
| 0.7229166666666668 | 38.653 |
| 0.7236111111111111 | 34.234 |
| 0.7243055555555555 | 43.079 |
| 0.725 | 43.079 |
| 0.7256944444444445 | 43.079 |
| 0.7263888888888889 | 43.079 |
| 0.7270833333333333 | 43.079 |
| 0.7277777777777777 | 38.653 |
| 0.7284722222222223 | 38.653 |
| 0.7291666666666666 | 34.234 |
| 0.7298611111111111 | 34.234 |
| 0.7305555555555556 | 29.823 |
| 0.7312500000000001 | 29.823 |
| 0.7319444444444444 | 29.823 |
| 0.7326388888888888 | 25.419 |
| 0.7333333333333334 | 25.419 |
| 0.7340277777777778 | 21.024 |
| 0.7347222222222222 | 21.024 |
| 0.7354166666666666 | 21.024 |
| 0.7361111111111112 | 21.024 |
| 0.7368055555555556 | 21.024 |
| 0.7374999999999999 | 21.024 |
| 0.7381944444444444 | 21.024 |
| 0.7388888888888889 | 16.636 |
| 0.7395833333333334 | 16.636 |
| 0.7402777777777777 | 16.636 |
| 0.7409722222222223 | 16.636 |
| 0.7416666666666667 | 16.636 |
| 0.7423611111111111 | 16.636 |
| 0.7430555555555555 | 16.636 |
| 0.74375 | 16.636 |
| 0.7444444444444445 | 12.257 |
| 0.7451388888888889 | 12.257 |
| 0.7458333333333332 | 12.257 |
| 0.7465277777777778 | 12.257 |
| 0.7472222222222222 | 12.257 |
| 0.7479166666666667 | 12.257 |
| 0.748611111111111 | 12.257 |
| 0.7493055555555556 | 12.257 |
| 0.75 | 7.887 |
| 0.7506944444444444 | 7.887 |
| 0.751388888888889 | 7.887 |
| 0.7520833333333333 | 7.887 |
| 0.7527777777777778 | 7.887 |
| 0.7534722222222222 | 3.525 |
| 0.7541666666666668 | 3.525 |
| 0.7548611111111111 | 3.525 |
| 0.7555555555555555 | 3.525 |
| 0.75625 | 3.525 |
| 0.7569444444444445 | 3.525 |
| 0.7576388888888889 | 3.525 |
| 0.7583333333333333 | 3.525 |
| 0.7590277777777777 | 3.525 |
| 0.7597222222222223 | 3.525 |
| 0.7604166666666666 | 3.525 |
| 0.7611111111111111 | 3.525 |
| 0.7618055555555556 | 3.525 |
| 0.7625000000000001 | 3.525 |
| 0.7631944444444444 | 0 |
| 0.7638888888888888 | 3.525 |
| 0.7645833333333334 | 0 |
| 0.7652777777777778 | 0 |
| 0.7659722222222222 | 0 |
| 0.7666666666666666 | 0 |
| 0.7673611111111112 | 0 |
| 0.7680555555555556 | 0 |
| 0.7687499999999999 | 0 |
| 0.7694444444444444 | 0 |
| 0.7701388888888889 | 0 |
| 0.7708333333333334 | 0 |
| 0.7715277777777777 | 0 |
| 0.7722222222222223 | 0 |
| 0.7729166666666667 | 0 |
| 0.7736111111111111 | 0 |
| 0.7743055555555555 | 0 |
| 0.775 | 0 |
| 0.7756944444444445 | 0 |
| 0.7763888888888889 | 0 |
| 0.7770833333333332 | 0 |
| 0.7777777777777778 | 0 |
| 0.7784722222222222 | 0 |
| 0.7791666666666667 | 0 |
| 0.779861111111111 | 0 |
| 0.7805555555555556 | 0 |
| 0.78125 | 0 |
| 0.7819444444444444 | 0 |
| 0.782638888888889 | 0 |
| 0.7833333333333333 | 0 |
| 0.7840277777777778 | 0 |
| 0.7847222222222222 | 0 |
| 0.7854166666666668 | 0 |
| 0.7861111111111111 | 0 |
| 0.7868055555555555 | 0 |
| 0.7875 | 0 |
| 0.7881944444444445 | 0 |
| 0.7888888888888889 | 0 |
| 0.7895833333333333 | 0 |
| 0.7902777777777777 | 0 |
| 0.7909722222222223 | 0 |
| 0.7916666666666666 | 0 |
| 0.7923611111111111 | 0 |
| 0.7930555555555556 | 0 |
| 0.7937500000000001 | 0 |
| 0.7944444444444444 | 0 |
| 0.7951388888888888 | 0 |
| 0.7958333333333334 | 0 |
| 0.7965277777777778 | 0 |
| 0.7972222222222222 | 0 |
| 0.7979166666666666 | 0 |
| 0.7986111111111112 | 0 |
| 0.7993055555555556 | 0 |
| 0.7999999999999999 | 0 |
| 0.8006944444444444 | 0 |
| 0.8013888888888889 | 0 |
| 0.8020833333333334 | 0 |
| 0.8027777777777777 | 0 |
| 0.8034722222222223 | 0 |
| 0.8041666666666667 | 0 |
| 0.8048611111111111 | 0 |
| 0.8055555555555555 | 0 |
| 0.80625 | 0 |
| 0.8069444444444445 | 0 |
| 0.8076388888888889 | 0 |
| 0.8083333333333332 | 0 |
| 0.8090277777777778 | 0 |
| 0.8097222222222222 | 0 |
| 0.8104166666666667 | 0 |
| 0.811111111111111 | 0 |
| 0.8118055555555556 | 0 |
| 0.8125 | 0 |
| 0.8131944444444444 | 0 |
| 0.813888888888889 | 0 |
| 0.8145833333333333 | 0 |
| 0.8152777777777778 | 0 |
| 0.8159722222222222 | 0 |
| 0.8166666666666668 | 0 |
| 0.8173611111111111 | 0 |
| 0.8180555555555555 | 0 |
| 0.81875 | 0 |
| 0.8194444444444445 | 0 |
| 0.8201388888888889 | 0 |
| 0.8208333333333333 | 0 |
| 0.8215277777777777 | 0 |
| 0.8222222222222223 | 0 |
| 0.8229166666666666 | 0 |
| 0.8236111111111111 | 0 |
| 0.8243055555555556 | 0 |
| 0.8250000000000001 | 0 |
| 0.8256944444444444 | 0 |
| 0.8263888888888888 | 0 |
| 0.8270833333333334 | 0 |
| 0.8277777777777778 | 0 |
| 0.8284722222222222 | 0 |
| 0.8291666666666666 | 0 |
| 0.8298611111111112 | 0 |
| 0.8305555555555556 | 0 |
| 0.8312499999999999 | 0 |
| 0.8319444444444444 | 0 |
| 0.8326388888888889 | 0 |
| 0.8333333333333334 | 0 |
| 0.8340277777777777 | 0 |
| 0.8347222222222223 | 0 |
| 0.8354166666666667 | 0 |
| 0.8361111111111111 | 0 |
| 0.8368055555555555 | 0 |
| 0.8375 | 0 |
| 0.8381944444444445 | 0 |
| 0.8388888888888889 | 0 |
| 0.8395833333333332 | 0 |
| 0.8402777777777778 | 0 |
| 0.8409722222222222 | 0 |
| 0.8416666666666667 | 0 |
| 0.842361111111111 | 0 |
| 0.8430555555555556 | 0 |
| 0.84375 | 0 |
| 0.8444444444444444 | 0 |
| 0.845138888888889 | 0 |
| 0.8458333333333333 | 0 |
| 0.8465277777777778 | 0 |
| 0.8472222222222222 | 0 |
| 0.8479166666666668 | 0 |
| 0.8486111111111111 | 0 |
| 0.8493055555555555 | 0 |
| 0.85 | 0 |
| 0.8506944444444445 | 0 |
| 0.8513888888888889 | 0 |
| 0.8520833333333333 | 0 |
| 0.8527777777777777 | 0 |
| 0.8534722222222223 | 0 |
| 0.8541666666666666 | 0 |
| 0.8548611111111111 | 0 |
| 0.8555555555555556 | 0 |
| 0.8562500000000001 | 0 |
| 0.8569444444444444 | 0 |
| 0.8576388888888888 | 0 |
| 0.8583333333333334 | 0 |
| 0.8590277777777778 | 0 |
| 0.8597222222222222 | 0 |
| 0.8604166666666666 | 0 |
| 0.8611111111111112 | 0 |
| 0.8618055555555556 | 0 |
| 0.8624999999999999 | 0 |
| 0.8631944444444444 | 0 |
| 0.8638888888888889 | 0 |
| 0.8645833333333334 | 0 |
| 0.8652777777777777 | 0 |
| 0.8659722222222223 | 0 |
| 0.8666666666666667 | 0 |
| 0.8673611111111111 | 0 |
| 0.8680555555555555 | 0 |
| 0.86875 | 0 |
| 0.8694444444444445 | 0 |
| 0.8701388888888889 | 0 |
| 0.8708333333333332 | 0 |
| 0.8715277777777778 | 0 |
| 0.8722222222222222 | 0 |
| 0.8729166666666667 | 0 |
| 0.873611111111111 | 0 |
| 0.8743055555555556 | 0 |
| 0.875 | 0 |
| 0.8756944444444444 | 0 |
| 0.876388888888889 | 0 |
| 0.8770833333333333 | 0 |
| 0.8777777777777778 | 0 |
| 0.8784722222222222 | 0 |
| 0.8791666666666668 | 0 |
| 0.8798611111111111 | 0 |
| 0.8805555555555555 | 0 |
| 0.88125 | 0 |
| 0.8819444444444445 | 0 |
| 0.8826388888888889 | 0 |
| 0.8833333333333333 | 0 |
| 0.8840277777777777 | 0 |
| 0.8847222222222223 | 0 |
| 0.8854166666666666 | 0 |
| 0.8861111111111111 | 0 |
| 0.8868055555555556 | 0 |
| 0.8875000000000001 | 0 |
| 0.8881944444444444 | 0 |
| 0.8888888888888888 | 0 |
| 0.8895833333333334 | 0 |
| 0.8902777777777778 | 0 |
| 0.8909722222222222 | 0 |
| 0.8916666666666666 | 0 |
| 0.8923611111111112 | 0 |
| 0.8930555555555556 | 0 |
| 0.8937499999999999 | 0 |
| 0.8944444444444444 | 0 |
| 0.8951388888888889 | 0 |
| 0.8958333333333334 | 0 |
| 0.8965277777777777 | 0 |
| 0.8972222222222223 | 0 |
| 0.8979166666666667 | 0 |
| 0.8986111111111111 | 0 |
| 0.8993055555555555 | 0 |
| 0.9 | 0 |
| 0.9006944444444445 | 0 |
| 0.9013888888888889 | 0 |
| 0.9020833333333332 | 0 |
| 0.9027777777777778 | 0 |
| 0.9034722222222222 | 0 |
| 0.9041666666666667 | 0 |
| 0.904861111111111 | 0 |
| 0.9055555555555556 | 0 |
| 0.90625 | 0 |
| 0.9069444444444444 | 0 |
| 0.907638888888889 | 0 |
| 0.9083333333333333 | 0 |
| 0.9090277777777778 | 0 |
| 0.9097222222222222 | 0 |
| 0.9104166666666668 | 0 |
| 0.9111111111111111 | 0 |
| 0.9118055555555555 | 0 |
| 0.9125 | 0 |
| 0.9131944444444445 | 0 |
| 0.9138888888888889 | 0 |
| 0.9145833333333333 | 0 |
| 0.9152777777777777 | 0 |
| 0.9159722222222223 | 0 |
| 0.9166666666666666 | 0 |
| 0.9173611111111111 | 0 |
| 0.9180555555555556 | 0 |
| 0.9187500000000001 | 0 |
| 0.9194444444444444 | 0 |
| 0.9201388888888888 | 0 |
| 0.9208333333333334 | 0 |
| 0.9215277777777778 | 0 |
| 0.9222222222222222 | 0 |
| 0.9229166666666666 | 0 |
| 0.9236111111111112 | 0 |
| 0.9243055555555556 | 0 |
| 0.9249999999999999 | 0 |
| 0.9256944444444444 | 0 |
| 0.9263888888888889 | 0 |
| 0.9270833333333334 | 0 |
| 0.9277777777777777 | 0 |
| 0.9284722222222223 | 0 |
| 0.9291666666666667 | 0 |
| 0.9298611111111111 | 0 |
| 0.9305555555555555 | 0 |
| 0.93125 | 0 |
| 0.9319444444444445 | 0 |
| 0.9326388888888889 | 0 |
| 0.9333333333333332 | 0 |
| 0.9340277777777778 | 0 |
| 0.9347222222222222 | 0 |
| 0.9354166666666667 | 0 |
| 0.936111111111111 | 0 |
| 0.9368055555555556 | 0 |
| 0.9375 | 0 |
| 0.9381944444444444 | 0 |
| 0.938888888888889 | 0 |
| 0.9395833333333333 | 0 |
| 0.9402777777777778 | 0 |
| 0.9409722222222222 | 0 |
| 0.9416666666666668 | 0 |
| 0.9423611111111111 | 0 |
| 0.9430555555555555 | 0 |
| 0.94375 | 0 |
| 0.9444444444444445 | 0 |
| 0.9451388888888889 | 0 |
| 0.9458333333333333 | 0 |
| 0.9465277777777777 | 0 |
| 0.9472222222222223 | 0 |
| 0.9479166666666666 | 0 |
| 0.9486111111111111 | 0 |
| 0.9493055555555556 | 0 |
| 0.9500000000000001 | 0 |
| 0.9506944444444444 | 0 |
| 0.9513888888888888 | 0 |
| 0.9520833333333334 | 0 |
| 0.9527777777777778 | 0 |
| 0.9534722222222222 | 0 |
| 0.9541666666666666 | 0 |
| 0.9548611111111112 | 0 |
| 0.9555555555555556 | 0 |
| 0.9562499999999999 | 0 |
| 0.9569444444444444 | 0 |
| 0.9576388888888889 | 0 |
| 0.9583333333333334 | 0 |
| 0.9590277777777777 | 0 |
| 0.9597222222222223 | 0 |
| 0.9604166666666667 | 0 |
| 0.9611111111111111 | 0 |
| 0.9618055555555555 | 0 |
| 0.9625 | 0 |
| 0.9631944444444445 | 0 |
| 0.9638888888888889 | 0 |
| 0.9645833333333332 | 0 |
| 0.9652777777777778 | 0 |
| 0.9659722222222222 | 0 |
| 0.9666666666666667 | 0 |
| 0.967361111111111 | 0 |
| 0.9680555555555556 | 0 |
| 0.96875 | 0 |
| 0.9694444444444444 | 0 |
| 0.970138888888889 | 0 |
| 0.9708333333333333 | 0 |
| 0.9715277777777778 | 0 |
| 0.9722222222222222 | 0 |
| 0.9729166666666668 | 0 |
| 0.9736111111111111 | 0 |
| 0.9743055555555555 | 0 |
| 0.975 | 0 |
| 0.9756944444444445 | 0 |
| 0.9763888888888889 | 0 |
| 0.9770833333333333 | 0 |
| 0.9777777777777777 | 0 |
| 0.9784722222222223 | 0 |
| 0.9791666666666666 | 0 |
| 0.9798611111111111 | 0 |
| 0.9805555555555556 | 0 |
| 0.9812500000000001 | 0 |
| 0.9819444444444444 | 0 |
| 0.9826388888888888 | 0 |
| 0.9833333333333334 | 0 |
| 0.9840277777777778 | 0 |
| 0.9847222222222222 | 0 |
| 0.9854166666666666 | 0 |
| 0.9861111111111112 | 0 |
| 0.9868055555555556 | 0 |
| 0.9874999999999999 | 0 |
| 0.9881944444444444 | 0 |
| 0.9888888888888889 | 0 |
| 0.9895833333333334 | 0 |
| 0.9902777777777777 | 0 |
| 0.9909722222222223 | 0 |
| 0.9916666666666667 | 0 |
| 0.9923611111111111 | 0 |
| 0.9930555555555555 | 0 |
| 0.99375 | 0 |
| 0.9944444444444445 | 0 |
| 0.9951388888888889 | 0 |
| 0.9958333333333332 | 0 |
| 0.9965277777777778 | 0 |
| 0.9972222222222222 | 0 |
| 0.9979166666666667 | 0 |
| 0.998611111111111 | 0 |
| 0.9993055555555556 | 0 |